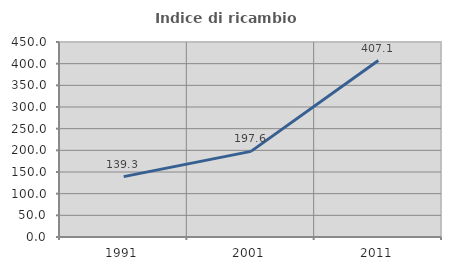
| Category | Indice di ricambio occupazionale  |
|---|---|
| 1991.0 | 139.344 |
| 2001.0 | 197.561 |
| 2011.0 | 407.143 |